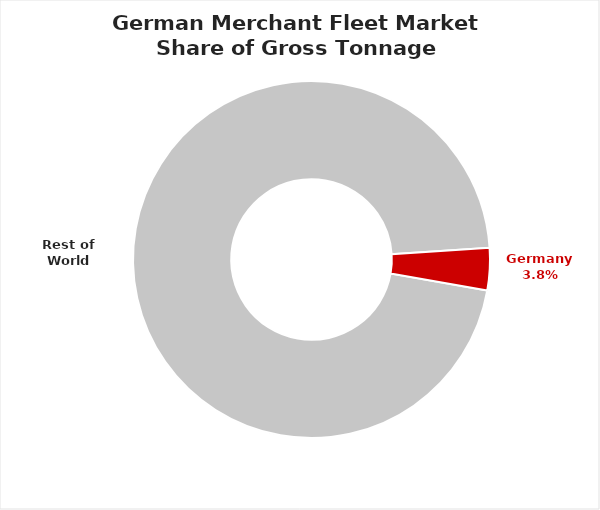
| Category | Container |
|---|---|
| Rest of World | 0.962 |
| Germany | 0.038 |